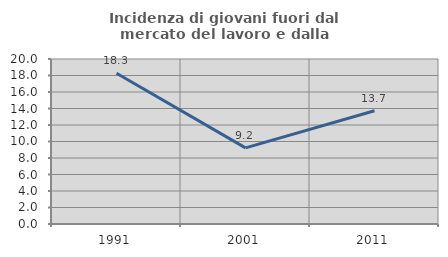
| Category | Incidenza di giovani fuori dal mercato del lavoro e dalla formazione  |
|---|---|
| 1991.0 | 18.269 |
| 2001.0 | 9.231 |
| 2011.0 | 13.725 |